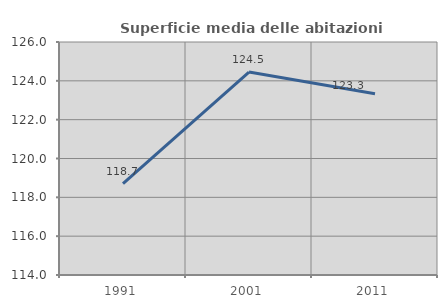
| Category | Superficie media delle abitazioni occupate |
|---|---|
| 1991.0 | 118.707 |
| 2001.0 | 124.453 |
| 2011.0 | 123.338 |